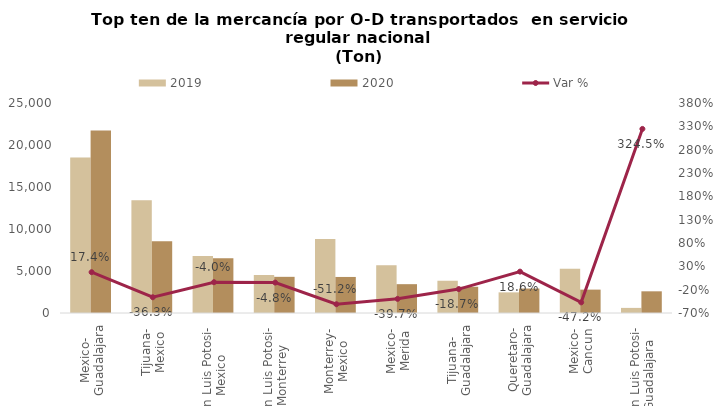
| Category | 2019 | 2020 |
|---|---|---|
| Mexico-
Guadalajara | 18504.189 | 21730.705 |
| Tijuana-
Mexico | 13410.12 | 8548.019 |
| San Luis Potosi-
Mexico | 6775.083 | 6503.38 |
| San Luis Potosi-
Monterrey | 4523.361 | 4306.467 |
| Monterrey-
Mexico | 8803.087 | 4292.039 |
| Mexico-
Merida | 5691.176 | 3432.49 |
| Tijuana-
Guadalajara | 3841.39 | 3121.744 |
| Queretaro-
Guadalajara | 2456.779 | 2914.684 |
| Mexico-
Cancun | 5271.451 | 2783.015 |
| San Luis Potosi-
Guadalajara | 608.135 | 2581.326 |